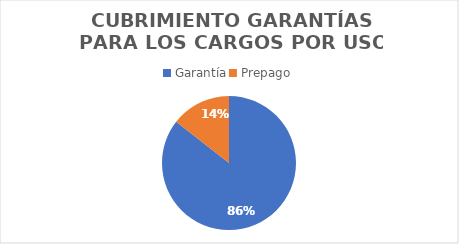
| Category | Series 0 |
|---|---|
| Garantía | 724717394129.867 |
| Prepago | 122470359556.133 |